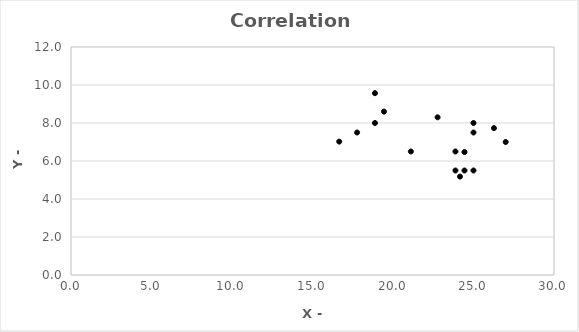
| Category | Series 0 |
|---|---|
| 18.88 | 9.57 |
| 17.77 | 7.5 |
| 18.88 | 8 |
| 21.11 | 6.5 |
| 22.77 | 8.3 |
| 26.27 | 7.73 |
| 24.44 | 6.47 |
| 24.44 | 5.5 |
| 23.88 | 5.5 |
| 25.0 | 5.5 |
| 27.0 | 7 |
| 25.0 | 8 |
| 25.0 | 7.5 |
| 24.16 | 5.18 |
| 23.88 | 6.5 |
| 19.44 | 8.6 |
| 16.66 | 7.02 |